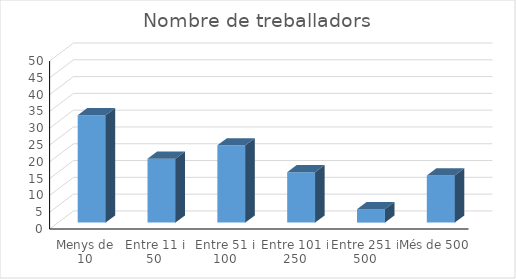
| Category | Series 0 |
|---|---|
| Menys de 10 | 32 |
| Entre 11 i 50 | 19 |
| Entre 51 i 100 | 23 |
| Entre 101 i 250 | 15 |
| Entre 251 i 500 | 4 |
| Més de 500 | 14 |